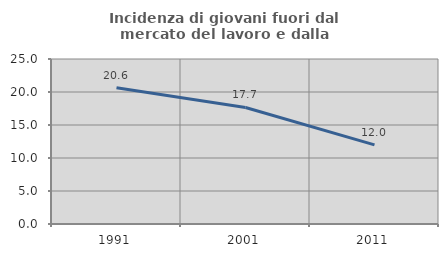
| Category | Incidenza di giovani fuori dal mercato del lavoro e dalla formazione  |
|---|---|
| 1991.0 | 20.633 |
| 2001.0 | 17.656 |
| 2011.0 | 11.987 |